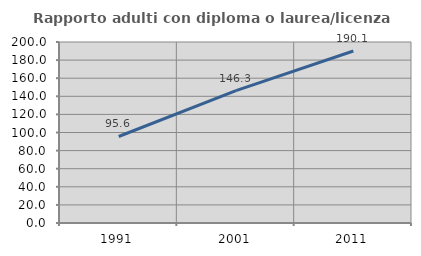
| Category | Rapporto adulti con diploma o laurea/licenza media  |
|---|---|
| 1991.0 | 95.585 |
| 2001.0 | 146.314 |
| 2011.0 | 190.083 |